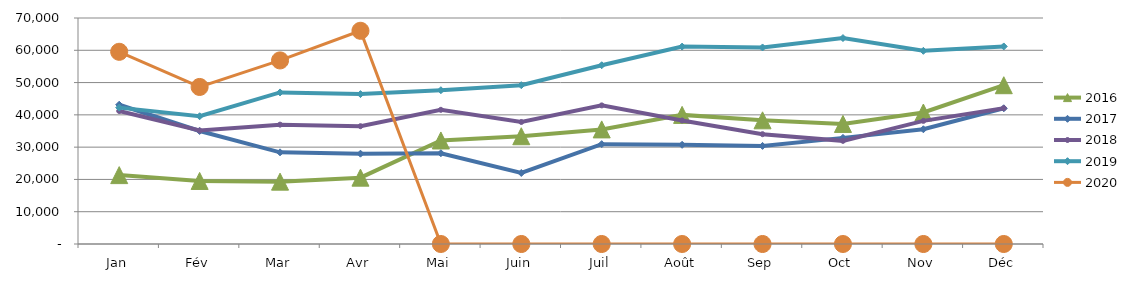
| Category | 2015 | 2016 | 2017 | 2018 | 2019 | 2020 |
|---|---|---|---|---|---|---|
| Jan |  | 21335.134 | 43138.429 | 41189.736 | 42238.432 | 59529.375 |
| Fév |  | 19532.337 | 35009.004 | 35137.047 | 39568.195 | 48642.784 |
| Mar |  | 19313.57 | 28389.673 | 36966.816 | 46942.202 | 56859.842 |
| Avr |  | 20550.618 | 27972.802 | 36485.223 | 46427.766 | 66040.178 |
| Mai |  | 32066.609 | 28116.194 | 41558.724 | 47634.031 | 0 |
| Juin |  | 33383.309 | 22002.869 | 37797.134 | 49186.221 | 0 |
| Juil |  | 35495.63 | 30926.131 | 42927.847 | 55367.883 | 0 |
| Août |  | 39992.765 | 30717.708 | 38263.165 | 61146.365 | 0 |
| Sep |  | 38306.611 | 30378.863 | 34011.672 | 60874.85 | 0 |
| Oct |  | 37188.976 | 32868.78 | 31946.792 | 63789.634 | 0 |
| Nov |  | 40729.636 | 35537.079 | 38139.513 | 59829.208 | 0 |
| Déc |  | 49180.232 | 42040.249 | 42064.579 | 61190.831 | 0 |